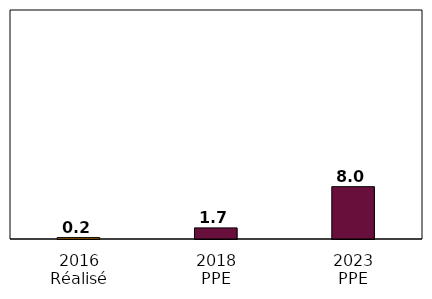
| Category | Series 0 |
|---|---|
| 2016
Réalisé | 0.215 |
| 2018
PPE | 1.7 |
| 2023
PPE | 8 |